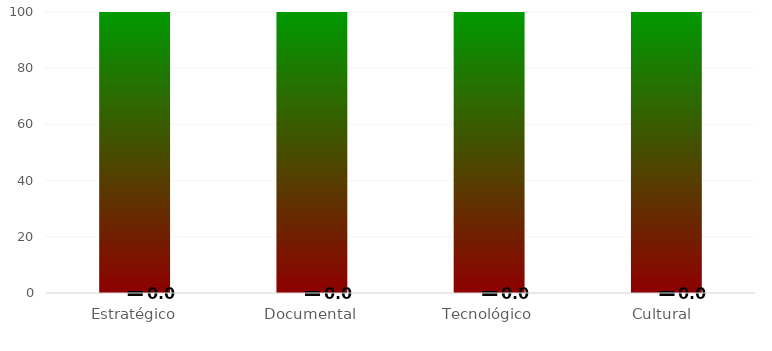
| Category | Niveles |
|---|---|
| Estratégico | 100 |
| Documental | 100 |
| Tecnológico | 100 |
| Cultural  | 100 |